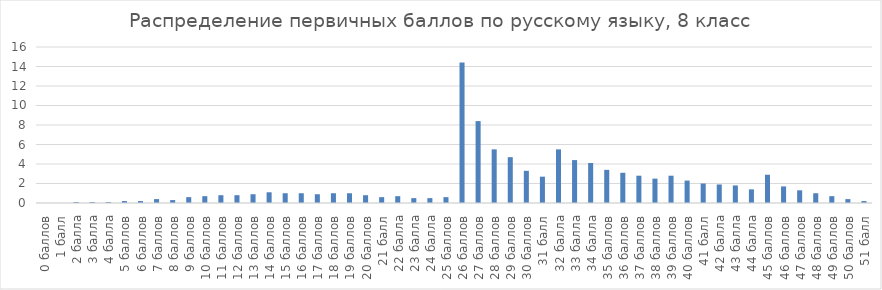
| Category | Series 0 |
|---|---|
| 0 баллов | 0 |
| 1 балл | 0 |
| 2 балла | 0.1 |
| 3 балла | 0.1 |
| 4 балла | 0.1 |
| 5 баллов | 0.2 |
| 6 баллов | 0.2 |
| 7 баллов | 0.4 |
| 8 баллов | 0.3 |
| 9 баллов | 0.6 |
| 10 баллов | 0.7 |
| 11 баллов | 0.8 |
| 12 баллов | 0.8 |
| 13 баллов | 0.9 |
| 14 баллов | 1.1 |
| 15 баллов | 1 |
| 16 баллов | 1 |
| 17 баллов | 0.9 |
| 18 баллов | 1 |
| 19 баллов | 1 |
| 20 баллов | 0.8 |
| 21 балл | 0.6 |
| 22 балла | 0.7 |
| 23 балла | 0.5 |
| 24 балла | 0.5 |
| 25 баллов | 0.6 |
| 26 баллов | 14.4 |
| 27 баллов | 8.4 |
| 28 баллов | 5.5 |
| 29 баллов | 4.7 |
| 30 баллов | 3.3 |
| 31 балл | 2.7 |
| 32 балла | 5.5 |
| 33 балла | 4.4 |
| 34 балла | 4.1 |
| 35 баллов | 3.4 |
| 36 баллов | 3.1 |
| 37 баллов | 2.8 |
| 38 баллов | 2.5 |
| 39 баллов | 2.8 |
| 40 баллов | 2.3 |
| 41 балл | 2 |
| 42 балла | 1.9 |
| 43 балла | 1.8 |
| 44 балла | 1.4 |
| 45 баллов | 2.9 |
| 46 баллов | 1.7 |
| 47 баллов | 1.3 |
| 48 баллов | 1 |
| 49 баллов | 0.7 |
| 50 баллов | 0.4 |
| 51 балл | 0.2 |